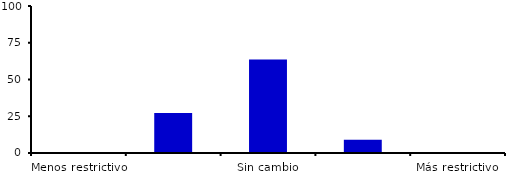
| Category | Series 0 |
|---|---|
| Menos restrictivo | 0 |
| Moderadamente menos restrictivo | 27.273 |
| Sin cambio | 63.636 |
| Moderadamente más restrictivo | 9.091 |
| Más restrictivo | 0 |